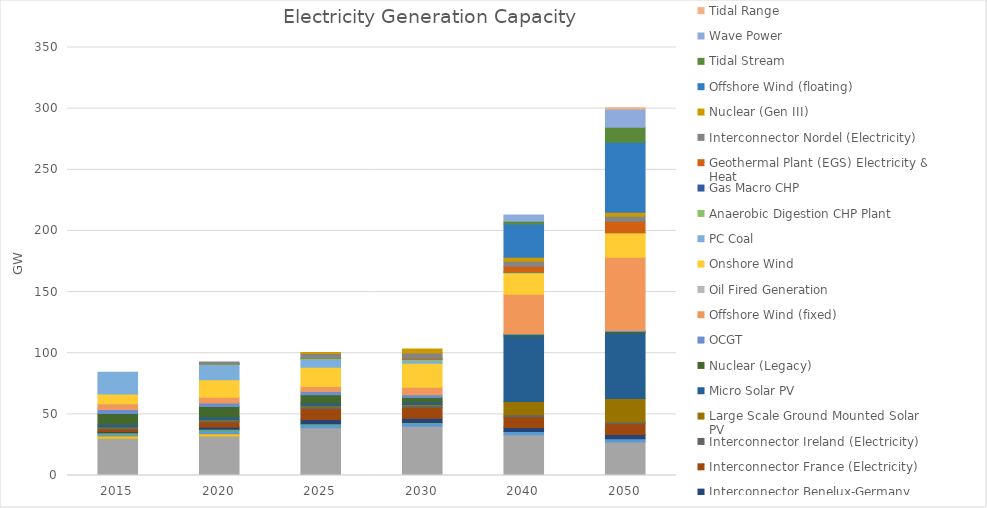
| Category | Biomass Fired Generation | CCGT | Converted Biomass Plant | Hydro Power | Incineration of Waste | Interconnector Benelux-Germany (Electricity) | Interconnector France (Electricity) | Interconnector Ireland (Electricity) | Large Scale Ground Mounted Solar PV | Micro Solar PV | Nuclear (Legacy) | OCGT | Offshore Wind (fixed) | Oil Fired Generation | Onshore Wind | PC Coal | Anaerobic Digestion CHP Plant | Gas Macro CHP | Geothermal Plant (EGS) Electricity & Heat | Interconnector Nordel (Electricity) | Nuclear (Gen III) | Offshore Wind (floating) | Tidal Stream | Wave Power | Tidal Range |
|---|---|---|---|---|---|---|---|---|---|---|---|---|---|---|---|---|---|---|---|---|---|---|---|---|---|
| 2015.0 | 0.225 | 30.236 | 1.875 | 1.341 | 1.2 | 1 | 2 | 1 | 0.831 | 2.206 | 8.741 | 3.316 | 4.619 | 0.066 | 8 | 17.848 | 0 | 0 | 0 | 0 | 0 | 0 | 0 | 0 | 0 |
| 2020.0 | 0.18 | 32.073 | 1.873 | 2.66 | 0.96 | 2 | 4 | 1 | 0.831 | 2.206 | 8.741 | 2.824 | 4.619 | 0 | 14.422 | 12.195 | 0.71 | 0.044 | 0.017 | 1.4 | 0 | 0 | 0 | 0 | 0 |
| 2025.0 | 0.135 | 38.963 | 0 | 2.59 | 0.72 | 3.4 | 8.8 | 1.5 | 0.831 | 2.206 | 6.981 | 2.483 | 4.246 | 0 | 15.721 | 6.297 | 0.71 | 0.044 | 0.017 | 4.2 | 0.7 | 0 | 0 | 0 | 0 |
| 2030.0 | 0.09 | 40.204 | 0 | 2.66 | 0.48 | 3.4 | 8.8 | 1.5 | 0.831 | 2.206 | 3.601 | 2.332 | 6.115 | 0 | 19.643 | 2.006 | 1.412 | 0.044 | 0.701 | 4.2 | 3.2 | 0 | 0 | 0 | 0 |
| 2040.0 | 0 | 33.227 | 0 | 2.66 | 0 | 3.4 | 8.8 | 1.5 | 10.831 | 53.602 | 1.191 | 0.809 | 32.243 | 0 | 17.377 | 0 | 0.71 | 0.044 | 4.655 | 4.2 | 3.2 | 27.16 | 2.337 | 5 | 0 |
| 2050.0 | 0 | 27.375 | 0 | 2.66 | 0 | 3.4 | 8.8 | 1.5 | 19.172 | 53.602 | 1.19 | 0.857 | 60 | 0 | 20 | 0 | 0.008 | 0 | 9.3 | 4.2 | 3.2 | 57.16 | 12.337 | 15 | 1.028 |